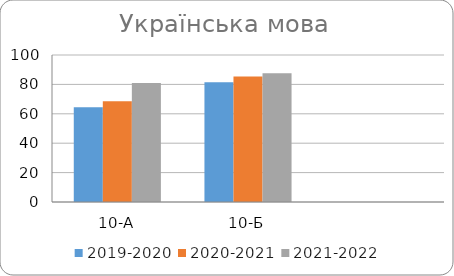
| Category | 2019-2020 | 2020-2021 | 2021-2022 |
|---|---|---|---|
| 10-А | 64.5 | 68.6 | 81 |
| 10-Б | 81.4 | 85.4 | 87.6 |